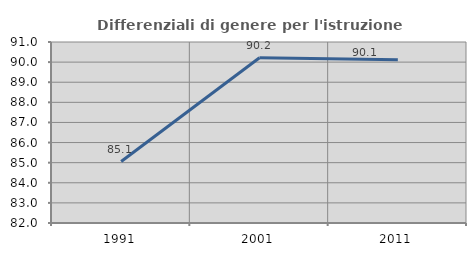
| Category | Differenziali di genere per l'istruzione superiore |
|---|---|
| 1991.0 | 85.056 |
| 2001.0 | 90.218 |
| 2011.0 | 90.115 |